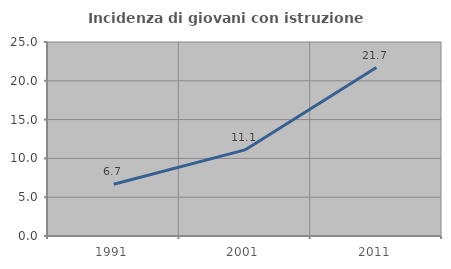
| Category | Incidenza di giovani con istruzione universitaria |
|---|---|
| 1991.0 | 6.667 |
| 2001.0 | 11.095 |
| 2011.0 | 21.701 |